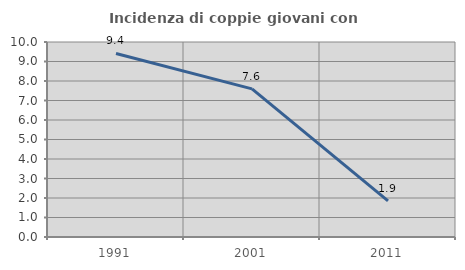
| Category | Incidenza di coppie giovani con figli |
|---|---|
| 1991.0 | 9.412 |
| 2001.0 | 7.595 |
| 2011.0 | 1.852 |